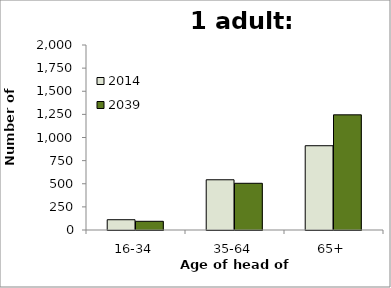
| Category | 2014 | 2039 |
|---|---|---|
| 16-34 | 111 | 94 |
| 35-64 | 543 | 505 |
| 65+ | 911 | 1245 |